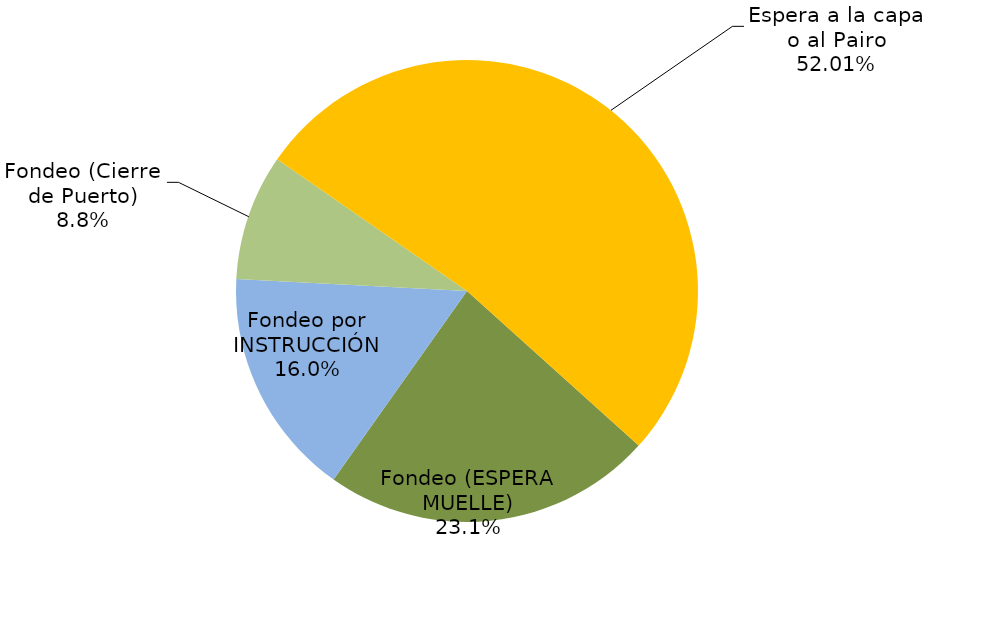
| Category | Series 0 |
|---|---|
| Fondeo (ESPERA MUELLE) | 1608.5 |
| Fondeo por INSTRUCCIÓN | 1114.683 |
| Fondeo (Cierre de Puerto) | 613.1 |
| Espera a la capa o al Pairo | 3616.383 |